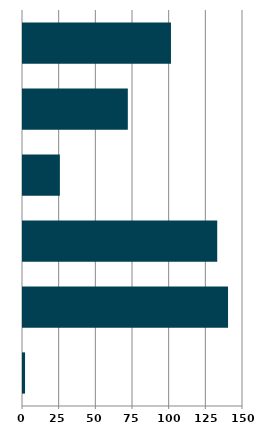
| Category | Series 0 |
|---|---|
| 0 | 1.394 |
| 1 | 139.806 |
| 2 | 132.429 |
| 3 | 25.137 |
| 4 | 71.473 |
| 5 | 100.889 |